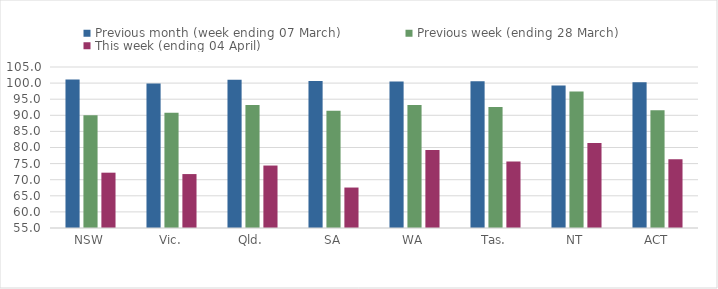
| Category | Previous month (week ending 07 March) | Previous week (ending 28 March) | This week (ending 04 April) |
|---|---|---|---|
| NSW | 101.106 | 90.041 | 72.18 |
| Vic. | 99.853 | 90.826 | 71.748 |
| Qld. | 101.044 | 93.202 | 74.398 |
| SA | 100.652 | 91.435 | 67.565 |
| WA | 100.523 | 93.222 | 79.193 |
| Tas. | 100.55 | 92.594 | 75.646 |
| NT | 99.257 | 97.367 | 81.413 |
| ACT | 100.269 | 91.555 | 76.363 |